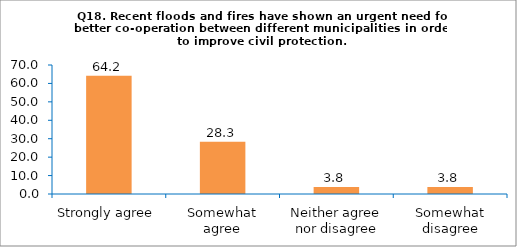
| Category | Series 0 |
|---|---|
| Strongly agree | 64.151 |
| Somewhat agree | 28.302 |
| Neither agree nor disagree | 3.774 |
| Somewhat disagree | 3.774 |